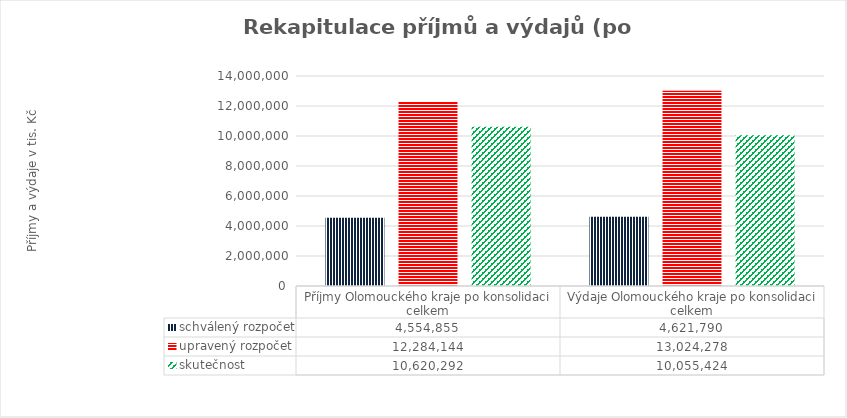
| Category | schválený rozpočet | upravený rozpočet | skutečnost |
|---|---|---|---|
| Příjmy Olomouckého kraje po konsolidaci celkem | 4554855 | 12284144 | 10620292 |
| Výdaje Olomouckého kraje po konsolidaci celkem | 4621790 | 13024278 | 10055424 |